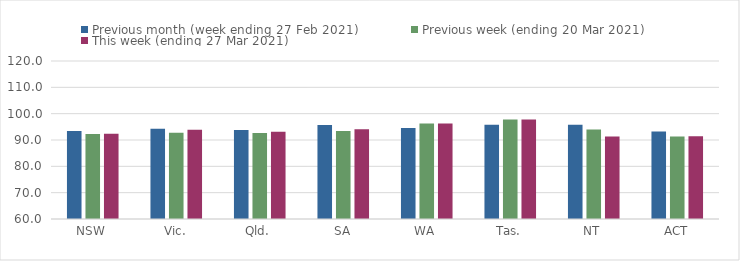
| Category | Previous month (week ending 27 Feb 2021) | Previous week (ending 20 Mar 2021) | This week (ending 27 Mar 2021) |
|---|---|---|---|
| NSW | 93.45 | 92.3 | 92.41 |
| Vic. | 94.23 | 92.76 | 93.89 |
| Qld. | 93.83 | 92.67 | 93.17 |
| SA | 95.74 | 93.42 | 94.08 |
| WA | 94.56 | 96.26 | 96.26 |
| Tas. | 95.78 | 97.79 | 97.79 |
| NT | 95.75 | 94.01 | 91.29 |
| ACT | 93.21 | 91.33 | 91.46 |